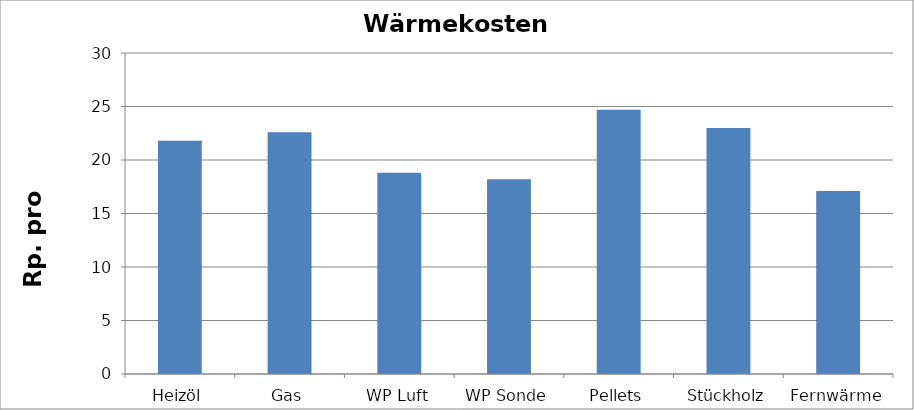
| Category | Wärmekosten [Rp./kWh] |
|---|---|
| Heizöl | 21.8 |
| Gas | 22.6 |
| WP Luft | 18.8 |
| WP Sonde | 18.2 |
| Pellets | 24.7 |
| Stückholz | 23 |
| Fernwärme | 17.1 |